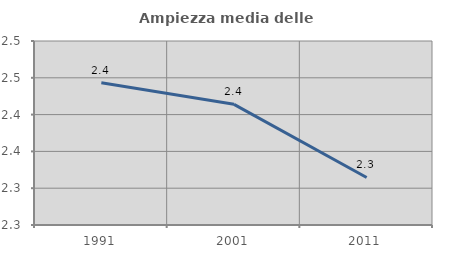
| Category | Ampiezza media delle famiglie |
|---|---|
| 1991.0 | 2.443 |
| 2001.0 | 2.414 |
| 2011.0 | 2.315 |